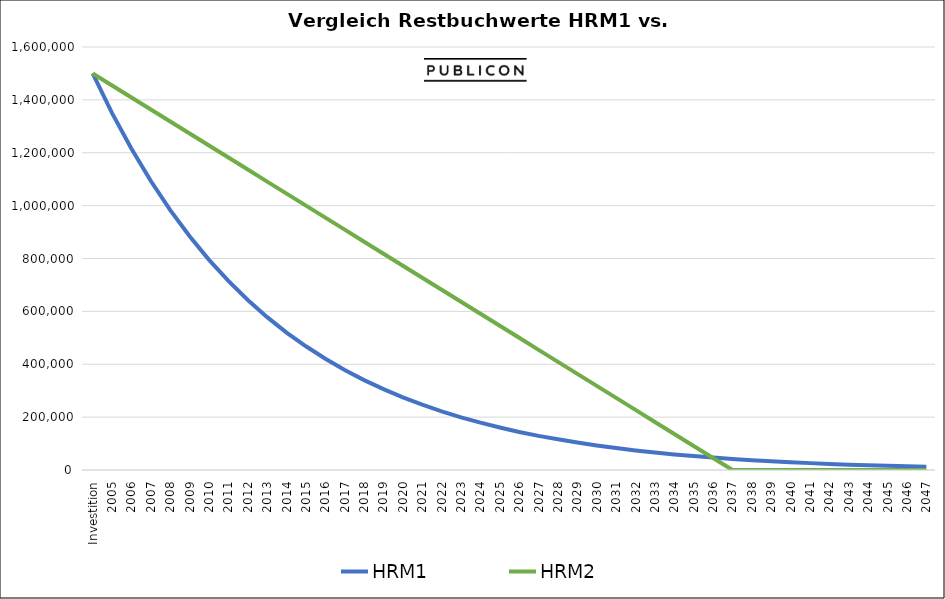
| Category | HRM1 | HRM2 |
|---|---|---|
| Investition | 1500000 | 1500000 |
| 2005 | 1350000 | 1454545.455 |
| 2006 | 1215000 | 1409090.909 |
| 2007 | 1093000 | 1363636.364 |
| 2008 | 983000 | 1318181.818 |
| 2009 | 884000 | 1272727.273 |
| 2010 | 795000 | 1227272.727 |
| 2011 | 715000 | 1181818.182 |
| 2012 | 643000 | 1136363.636 |
| 2013 | 578000 | 1090909.091 |
| 2014 | 520000 | 1045454.545 |
| 2015 | 468000 | 1000000 |
| 2016 | 421000 | 954545.455 |
| 2017 | 378000 | 909090.909 |
| 2018 | 340000 | 863636.364 |
| 2019 | 306000 | 818181.818 |
| 2020 | 275000 | 772727.273 |
| 2021 | 247000 | 727272.727 |
| 2022 | 222000 | 681818.182 |
| 2023 | 199000 | 636363.636 |
| 2024 | 179000 | 590909.091 |
| 2025 | 161000 | 545454.545 |
| 2026 | 144000 | 500000 |
| 2027 | 129000 | 454545.455 |
| 2028 | 116000 | 409090.909 |
| 2029 | 104000 | 363636.364 |
| 2030 | 93000 | 318181.818 |
| 2031 | 83000 | 272727.273 |
| 2032 | 74000 | 227272.727 |
| 2033 | 66000 | 181818.182 |
| 2034 | 59000 | 136363.636 |
| 2035 | 53000 | 90909.091 |
| 2036 | 47000 | 45454.545 |
| 2037 | 42000 | 0 |
| 2038 | 37000 | 0 |
| 2039 | 33000 | 0 |
| 2040 | 29000 | 0 |
| 2041 | 26000 | 0 |
| 2042 | 23000 | 0 |
| 2043 | 20000 | 0 |
| 2044 | 18000 | 0 |
| 2045 | 16000 | 0 |
| 2046 | 14000 | 0 |
| 2047 | 12000 | 0 |